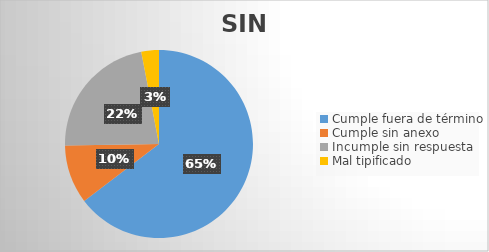
| Category | Series 0 |
|---|---|
| Cumple fuera de término | 64 |
| Cumple sin anexo | 10 |
| Incumple sin respuesta | 22 |
| Mal tipificado | 3 |